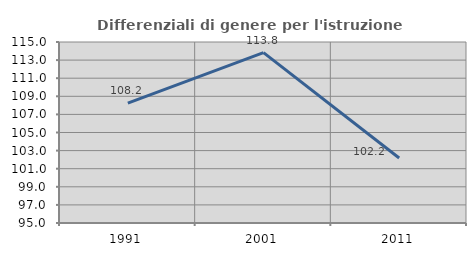
| Category | Differenziali di genere per l'istruzione superiore |
|---|---|
| 1991.0 | 108.245 |
| 2001.0 | 113.821 |
| 2011.0 | 102.179 |